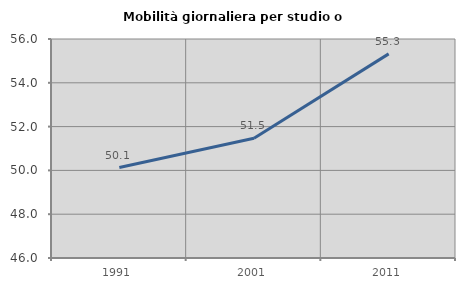
| Category | Mobilità giornaliera per studio o lavoro |
|---|---|
| 1991.0 | 50.13 |
| 2001.0 | 51.467 |
| 2011.0 | 55.322 |